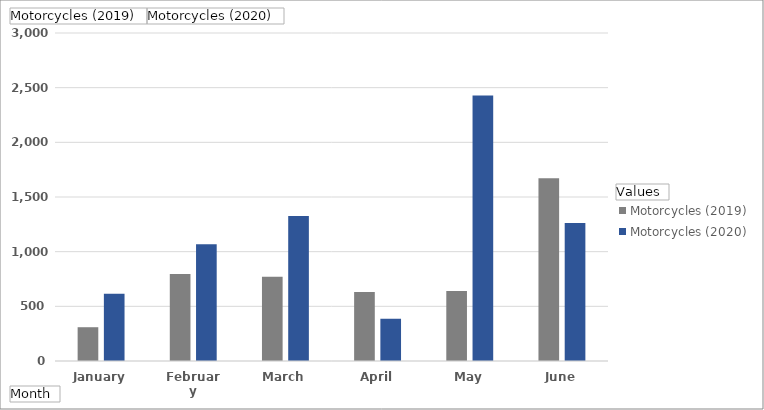
| Category | Motorcycles (2019) | Motorcycles (2020) |
|---|---|---|
| January | 309 | 614 |
| February | 795 | 1067 |
| March | 771 | 1326 |
| April | 631 | 387 |
| May | 640 | 2428 |
| June | 1672 | 1262 |